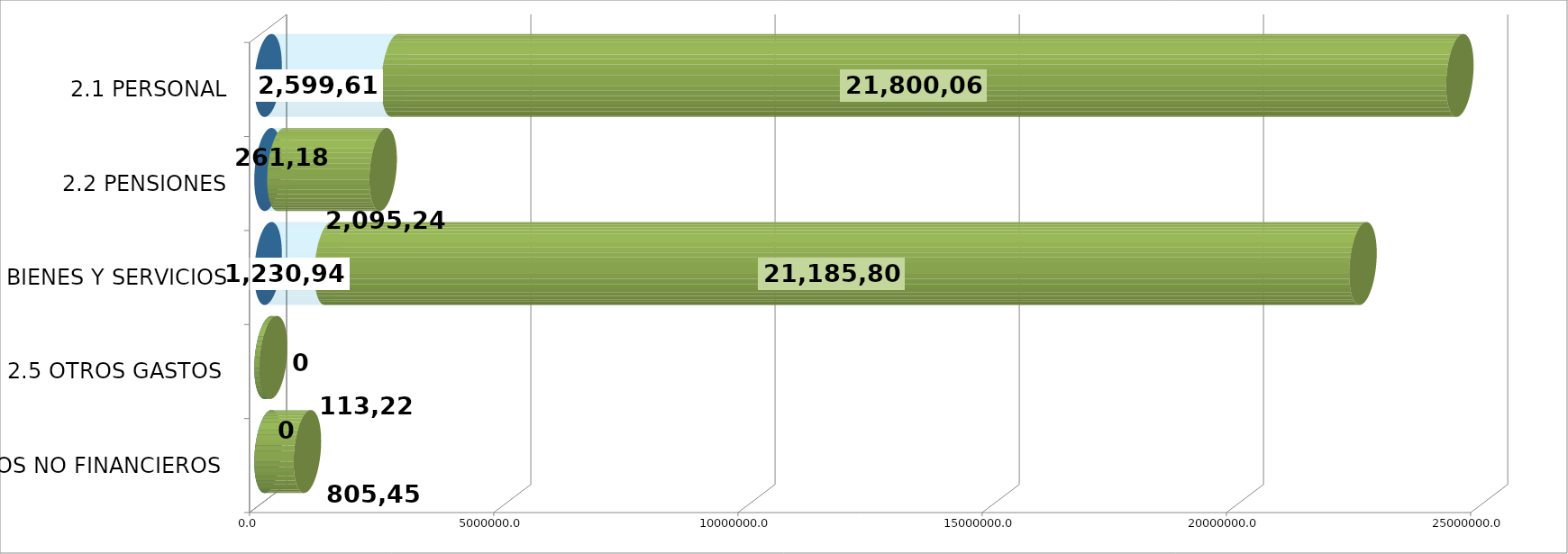
| Category | GENERICA | EJECUTADO | SALDO  |
|---|---|---|---|
| 2.1 PERSONAL | 0 | 2599616.3 | 21800065.7 |
| 2.2 PENSIONES | 0 | 261180.72 | 2095241.28 |
| 2.3 BIENES Y SERVICIOS | 0 | 1230945.4 | 21185799.6 |
| 2.5 OTROS GASTOS  | 0 | 0 | 113222 |
| 2.6 ACTIVOS NO FINANCIEROS  | 0 | 0 | 805452 |